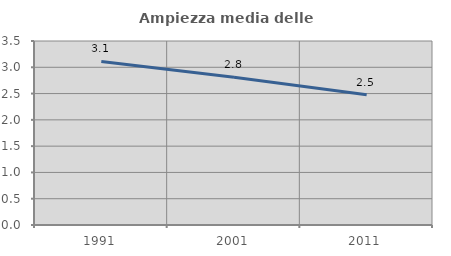
| Category | Ampiezza media delle famiglie |
|---|---|
| 1991.0 | 3.111 |
| 2001.0 | 2.811 |
| 2011.0 | 2.476 |